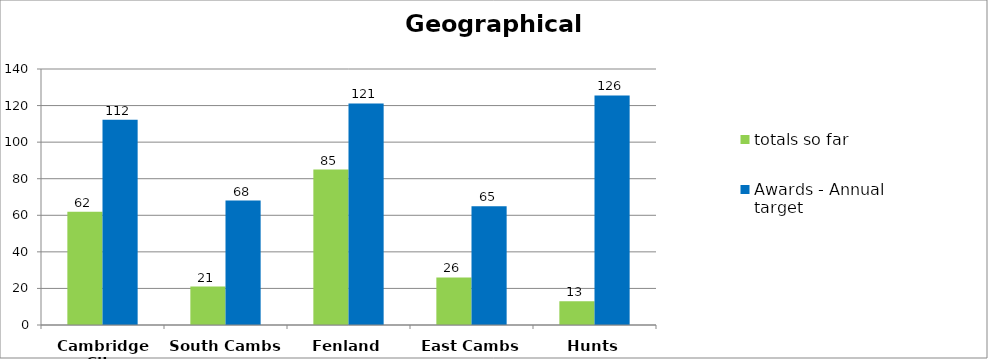
| Category | totals so far | Awards - Annual target  |
|---|---|---|
| Cambridge City | 62 | 112.24 |
| South Cambs | 21 | 68.08 |
| Fenland | 85 | 121.172 |
| East Cambs | 26 | 64.96 |
| Hunts | 13 | 125.544 |